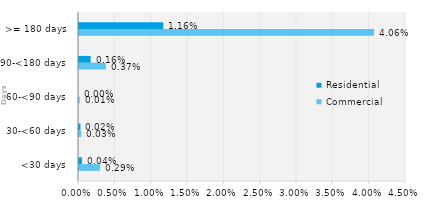
| Category | Commercial | Residential |
|---|---|---|
| <30 days | 0.003 | 0 |
| 30-<60 days | 0 | 0 |
| 60-<90 days | 0 | 0 |
| 90-<180 days | 0.004 | 0.002 |
| >= 180 days | 0.041 | 0.012 |